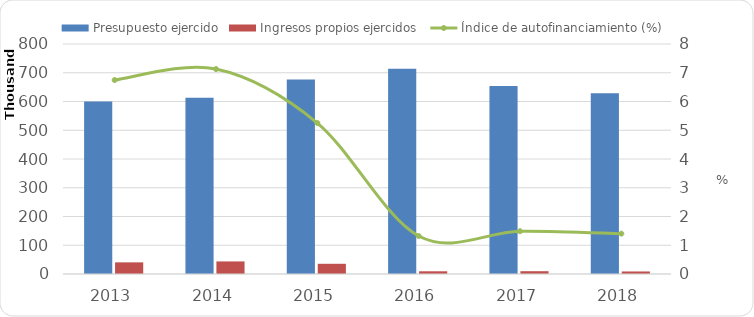
| Category | Presupuesto ejercido | Ingresos propios ejercidos  |
|---|---|---|
| 2013 | 600163.1 | 40487.2 |
| 2014 | 613052.1 | 43697.9 |
| 2015 | 676403.338 | 35517.936 |
| 2016 | 713725.8 | 9432.4 |
| 2017 | 653670.792 | 9727.901 |
| 2018 | 628799.563 | 8828.859 |